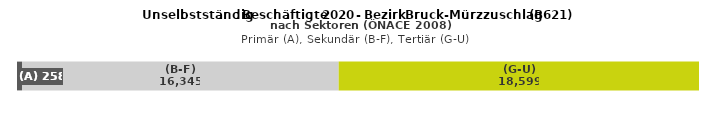
| Category | (A) | (B-F) | (G-U) |
|---|---|---|---|
| 0 | 258 | 16345 | 18599 |